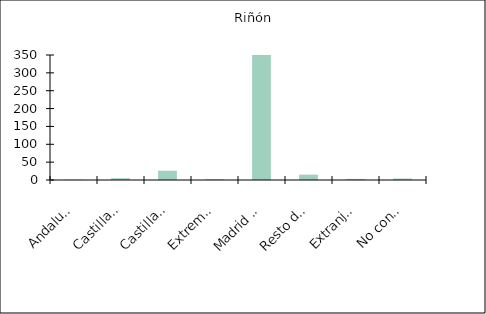
| Category | Riñón |
|---|---|
|    Andalucía | 1 |
|    Castilla y León | 5 |
|    Castilla-La Mancha | 26 |
|    Extremadura | 2 |
|    Madrid (Comunidad de) | 397 |
|    Resto de CCAA | 15 |
|    Extranjero | 3 |
|    No consta | 4 |